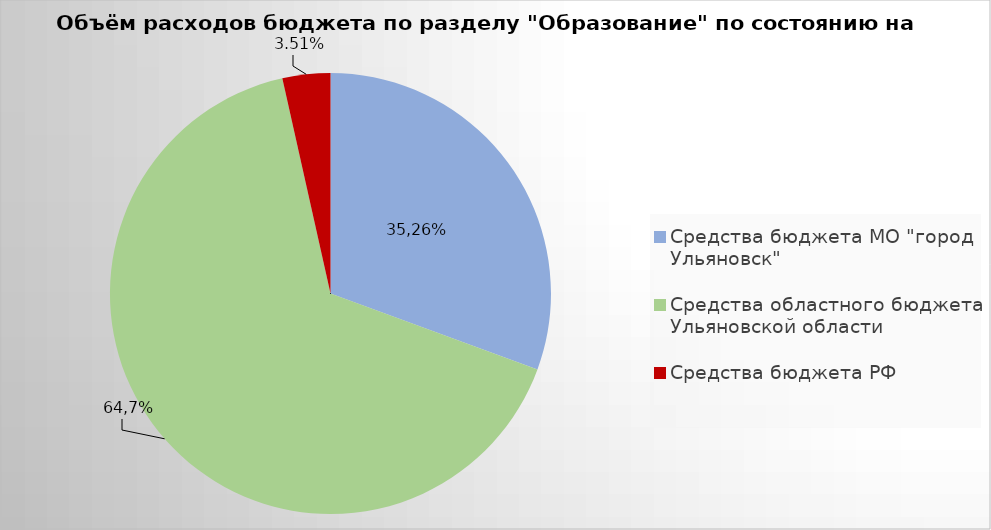
| Category | Series 0 |
|---|---|
| Средства бюджета МО "город Ульяновск" | 1810891.25 |
| Средства областного бюджета Ульяновской области | 3898448.2 |
| Средства бюджета РФ | 207487.6 |